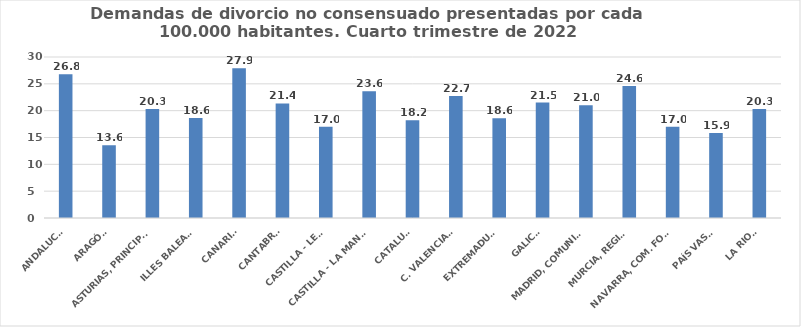
| Category | Series 0 |
|---|---|
| ANDALUCÍA | 26.798 |
| ARAGÓN | 13.571 |
| ASTURIAS, PRINCIPADO | 20.305 |
| ILLES BALEARS | 18.612 |
| CANARIAS | 27.919 |
| CANTABRIA | 21.353 |
| CASTILLA - LEÓN | 16.985 |
| CASTILLA - LA MANCHA | 23.62 |
| CATALUÑA | 18.21 |
| C. VALENCIANA | 22.735 |
| EXTREMADURA | 18.582 |
| GALICIA | 21.52 |
| MADRID, COMUNIDAD | 21.021 |
| MURCIA, REGIÓN | 24.61 |
| NAVARRA, COM. FORAL | 17.015 |
| PAÍS VASCO | 15.85 |
| LA RIOJA | 20.319 |